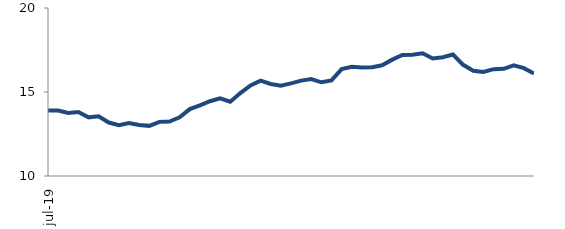
| Category | Series 0 |
|---|---|
| 2019-07-01 | 13.892 |
| 2019-08-01 | 13.894 |
| 2019-09-01 | 13.75 |
| 2019-10-01 | 13.812 |
| 2019-11-01 | 13.492 |
| 2019-12-01 | 13.558 |
| 2020-01-01 | 13.183 |
| 2020-02-01 | 13.023 |
| 2020-03-01 | 13.158 |
| 2020-04-01 | 13.04 |
| 2020-05-01 | 12.985 |
| 2020-06-01 | 13.222 |
| 2020-07-01 | 13.243 |
| 2020-08-01 | 13.494 |
| 2020-09-01 | 13.983 |
| 2020-10-01 | 14.201 |
| 2020-11-01 | 14.451 |
| 2020-12-01 | 14.626 |
| 2021-01-01 | 14.42 |
| 2021-02-01 | 14.935 |
| 2021-03-01 | 15.393 |
| 2021-04-01 | 15.673 |
| 2021-05-01 | 15.479 |
| 2021-06-01 | 15.374 |
| 2021-07-01 | 15.513 |
| 2021-08-01 | 15.678 |
| 2021-09-01 | 15.774 |
| 2021-10-01 | 15.578 |
| 2021-11-01 | 15.69 |
| 2021-12-01 | 16.364 |
| 2022-01-01 | 16.498 |
| 2022-02-01 | 16.464 |
| 2022-03-01 | 16.471 |
| 2022-04-01 | 16.588 |
| 2022-05-01 | 16.925 |
| 2022-06-01 | 17.203 |
| 2022-07-01 | 17.216 |
| 2022-08-01 | 17.305 |
| 2022-09-01 | 16.996 |
| 2022-10-01 | 17.071 |
| 2022-11-01 | 17.231 |
| 2022-12-01 | 16.617 |
| 2023-01-01 | 16.261 |
| 2023-02-01 | 16.194 |
| 2023-03-01 | 16.359 |
| 2023-04-01 | 16.383 |
| 2023-05-01 | 16.592 |
| 2023-06-01 | 16.419 |
| 2023-07-01 | 16.107 |